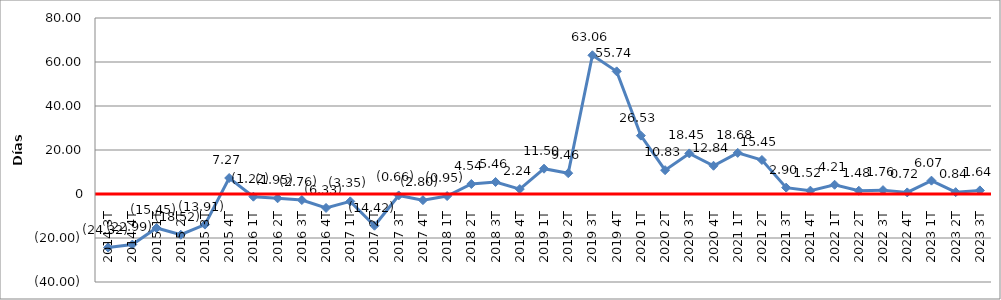
| Category | Series 0 |
|---|---|
| 2014 3T | -24.32 |
| 2014 4T | -22.99 |
| 2015 1T | -15.45 |
| 2015 2T | -18.52 |
| 2015 3T | -13.91 |
| 2015 4T | 7.27 |
| 2016 1T | -1.22 |
| 2016 2T | -1.95 |
| 2016 3T | -2.76 |
| 2016 4T | -6.33 |
| 2017 1T | -3.35 |
| 2017 2T | -14.42 |
| 2017 3T | -0.66 |
| 2017 4T | -2.8 |
| 2018 1T | -0.95 |
| 2018 2T | 4.54 |
| 2018 3T | 5.46 |
| 2018 4T | 2.24 |
| 2019 1T | 11.5 |
| 2019 2T | 9.46 |
| 2019 3T | 63.06 |
| 2019 4T | 55.74 |
| 2020 1T | 26.53 |
| 2020 2T | 10.83 |
| 2020 3T | 18.45 |
| 2020 4T | 12.84 |
| 2021 1T | 18.68 |
| 2021 2T | 15.45 |
| 2021 3T | 2.9 |
| 2021 4T | 1.52 |
| 2022 1T | 4.21 |
| 2022 2T | 1.48 |
| 2022 3T | 1.76 |
| 2022 4T | 0.72 |
| 2023 1T | 6.07 |
| 2023 2T | 0.84 |
| 2023 3T | 1.64 |